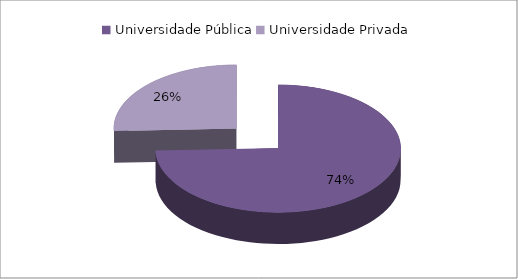
| Category | Feminino | Masculino |
|---|---|---|
| Universidade Pública | 61 | 28 |
| Universidade Privada | 21 | 19 |